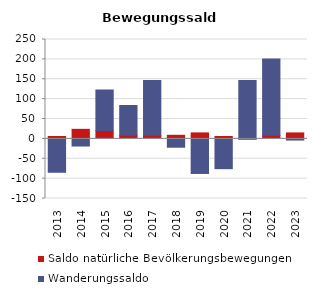
| Category | Saldo natürliche Bevölkerungsbewegungen | Wanderungssaldo |
|---|---|---|
| 2013.0 | 6 | -84 |
| 2014.0 | 24 | -18 |
| 2015.0 | 21 | 102 |
| 2016.0 | 9 | 75 |
| 2017.0 | 9 | 138 |
| 2018.0 | 9 | -21 |
| 2019.0 | 15 | -87 |
| 2020.0 | 6 | -75 |
| 2021.0 | -3 | 147 |
| 2022.0 | 9 | 192 |
| 2023.0 | 15 | -3 |